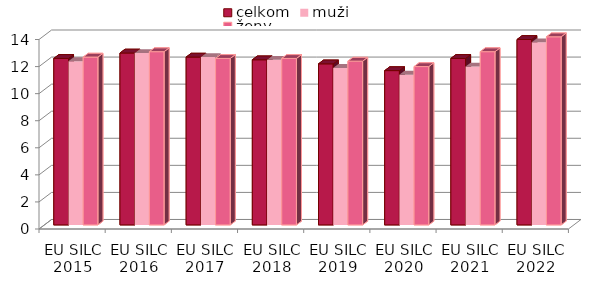
| Category | celkom | muži | ženy |
|---|---|---|---|
| EU SILC 2015 | 12.3 | 12.1 | 12.4 |
| EU SILC 2016 | 12.7 | 12.7 | 12.8 |
| EU SILC 2017 | 12.4 | 12.4 | 12.3 |
| EU SILC 2018 | 12.2 | 12.2 | 12.3 |
| EU SILC 2019 | 11.9 | 11.6 | 12.1 |
| EU SILC 2020 | 11.4 | 11.1 | 11.7 |
| EU SILC 2021 | 12.3 | 11.7 | 12.8 |
| EU SILC 2022 | 13.7 | 13.5 | 13.9 |